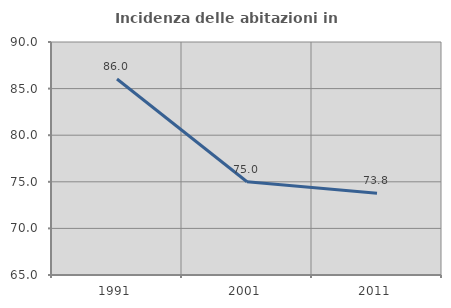
| Category | Incidenza delle abitazioni in proprietà  |
|---|---|
| 1991.0 | 86.034 |
| 2001.0 | 75 |
| 2011.0 | 73.77 |